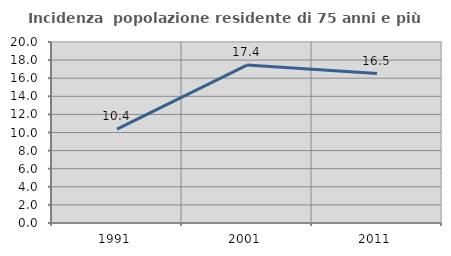
| Category | Incidenza  popolazione residente di 75 anni e più |
|---|---|
| 1991.0 | 10.372 |
| 2001.0 | 17.447 |
| 2011.0 | 16.518 |